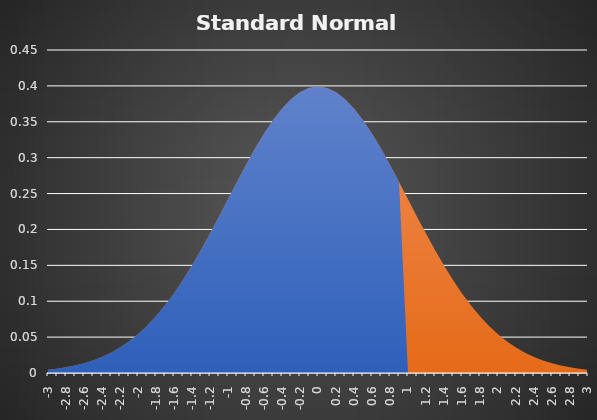
| Category | Z-Value | Area |
|---|---|---|
| -3.0 | 0.004 | 0.004 |
| -2.9 | 0.006 | 0.006 |
| -2.8 | 0.008 | 0.008 |
| -2.6999999999999997 | 0.01 | 0.01 |
| -2.5999999999999996 | 0.014 | 0.014 |
| -2.4999999999999996 | 0.018 | 0.018 |
| -2.3999999999999995 | 0.022 | 0.022 |
| -2.2999999999999994 | 0.028 | 0.028 |
| -2.1999999999999993 | 0.035 | 0.035 |
| -2.099999999999999 | 0.044 | 0.044 |
| -1.9999999999999991 | 0.054 | 0.054 |
| -1.899999999999999 | 0.066 | 0.066 |
| -1.799999999999999 | 0.079 | 0.079 |
| -1.6999999999999988 | 0.094 | 0.094 |
| -1.5999999999999988 | 0.111 | 0.111 |
| -1.4999999999999987 | 0.13 | 0.13 |
| -1.3999999999999986 | 0.15 | 0.15 |
| -1.2999999999999985 | 0.171 | 0.171 |
| -1.1999999999999984 | 0.194 | 0.194 |
| -1.0999999999999983 | 0.218 | 0.218 |
| -0.9999999999999983 | 0.242 | 0.242 |
| -0.8999999999999984 | 0.266 | 0.266 |
| -0.7999999999999984 | 0.29 | 0.29 |
| -0.6999999999999984 | 0.312 | 0.312 |
| -0.5999999999999984 | 0.333 | 0.333 |
| -0.49999999999999845 | 0.352 | 0.352 |
| -0.39999999999999847 | 0.368 | 0.368 |
| -0.2999999999999985 | 0.381 | 0.381 |
| -0.19999999999999848 | 0.391 | 0.391 |
| -0.09999999999999848 | 0.397 | 0.397 |
| 0.0 | 0.399 | 0.399 |
| 0.1 | 0.397 | 0.397 |
| 0.2 | 0.391 | 0.391 |
| 0.30000000000000004 | 0.381 | 0.381 |
| 0.4 | 0.368 | 0.368 |
| 0.5 | 0.352 | 0.352 |
| 0.6 | 0.333 | 0.333 |
| 0.7 | 0.312 | 0.312 |
| 0.7999999999999999 | 0.29 | 0.29 |
| 0.8999999999999999 | 0.266 | 0.266 |
| 0.9999999999999999 | 0.242 | 0 |
| 1.0999999999999999 | 0.218 | 0 |
| 1.2 | 0.194 | 0 |
| 1.3 | 0.171 | 0 |
| 1.4000000000000001 | 0.15 | 0 |
| 1.5000000000000002 | 0.13 | 0 |
| 1.6000000000000003 | 0.111 | 0 |
| 1.7000000000000004 | 0.094 | 0 |
| 1.8000000000000005 | 0.079 | 0 |
| 1.9000000000000006 | 0.066 | 0 |
| 2.0000000000000004 | 0.054 | 0 |
| 2.1000000000000005 | 0.044 | 0 |
| 2.2000000000000006 | 0.035 | 0 |
| 2.3000000000000007 | 0.028 | 0 |
| 2.400000000000001 | 0.022 | 0 |
| 2.500000000000001 | 0.018 | 0 |
| 2.600000000000001 | 0.014 | 0 |
| 2.700000000000001 | 0.01 | 0 |
| 2.800000000000001 | 0.008 | 0 |
| 2.9000000000000012 | 0.006 | 0 |
| 3.0000000000000013 | 0.004 | 0 |